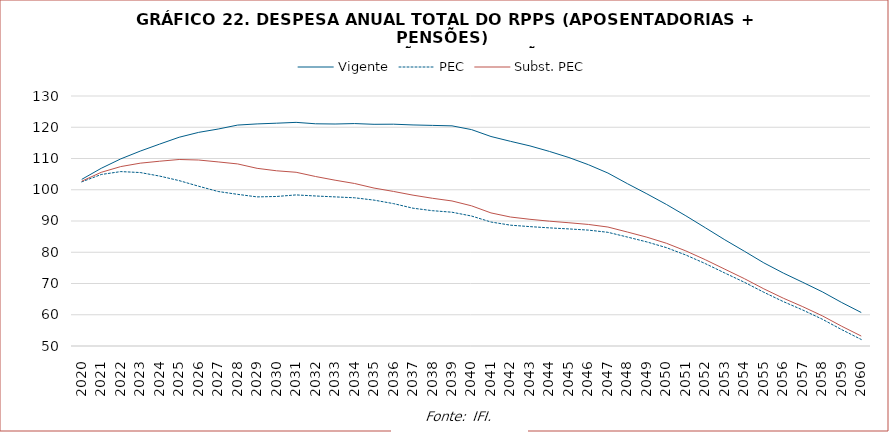
| Category | Vigente | PEC | Subst. PEC |
|---|---|---|---|
| 2020.0 | 103322328962.247 | 102528606726.985 | 102738471057.132 |
| 2021.0 | 106863556736.48 | 104880288316.188 | 105578561357.116 |
| 2022.0 | 109870527916.364 | 105810268058.543 | 107410471654.951 |
| 2023.0 | 112363309757.279 | 105506399516.951 | 108500146946.258 |
| 2024.0 | 114619317397.191 | 104370898415.554 | 109132309984.239 |
| 2025.0 | 116800942941.284 | 102922462437.356 | 109680632970.822 |
| 2026.0 | 118361750666.476 | 101122766803.295 | 109514433457.211 |
| 2027.0 | 119429953126.77 | 99437169680.174 | 108907999956.665 |
| 2028.0 | 120696785475.762 | 98528062124.301 | 108262766188.172 |
| 2029.0 | 121067687292.128 | 97712136361.552 | 106850943738.759 |
| 2030.0 | 121299079146.364 | 97848954327.123 | 106068527922.199 |
| 2031.0 | 121564632041.104 | 98348477468.569 | 105591062786.603 |
| 2032.0 | 121106348489.062 | 98004309017.197 | 104233607656.402 |
| 2033.0 | 121038264403.37 | 97714567831.177 | 103059320489.482 |
| 2034.0 | 121179137623.656 | 97428901904.697 | 102002348197.944 |
| 2035.0 | 120940281916.012 | 96682988615.843 | 100535594373.768 |
| 2036.0 | 120975480434.197 | 95560041873.456 | 99456015787.373 |
| 2037.0 | 120735666057.381 | 94093907148.042 | 98268283585.344 |
| 2038.0 | 120591160432.63 | 93297780895.574 | 97265403166.529 |
| 2039.0 | 120449373664.016 | 92811233211.903 | 96414660652.216 |
| 2040.0 | 119248305007.006 | 91596538302.157 | 94855820552.712 |
| 2041.0 | 117035728837.541 | 89674782720.571 | 92587046494.699 |
| 2042.0 | 115498108058.622 | 88664358560.636 | 91273481601.475 |
| 2043.0 | 114033094356.123 | 88199614621.99 | 90542709524.366 |
| 2044.0 | 112262905606.571 | 87797083572.164 | 89944241975.044 |
| 2045.0 | 110307096810.256 | 87462801128.88 | 89438423735.771 |
| 2046.0 | 108013841974.586 | 87082030017.786 | 88898061312.657 |
| 2047.0 | 105346085921.72 | 86379848692.955 | 88067257040.877 |
| 2048.0 | 101945857208.568 | 84863391843.816 | 86471214590.098 |
| 2049.0 | 98692343008.594 | 83302592923.252 | 84817267281.949 |
| 2050.0 | 95303776997.03 | 81475310164.354 | 82883708451.418 |
| 2051.0 | 91656084545.624 | 79108223770.811 | 80422462740.029 |
| 2052.0 | 87837642989.498 | 76359903948.253 | 77609300282.084 |
| 2053.0 | 83981601919.22 | 73349144449.418 | 74575434659.067 |
| 2054.0 | 80330903591.391 | 70403218885.646 | 71558727369.7 |
| 2055.0 | 76608614224.957 | 67196228808.851 | 68291874450.188 |
| 2056.0 | 73342396725.437 | 64211325872.041 | 65297746936.324 |
| 2057.0 | 70379305637.269 | 61507968350.576 | 62582357991.535 |
| 2058.0 | 67345565154.111 | 58579985718.929 | 59664140520.316 |
| 2059.0 | 63900381084.508 | 55225580953.133 | 56311844300.748 |
| 2060.0 | 60717547487.849 | 52086799467.39 | 53181670224.908 |